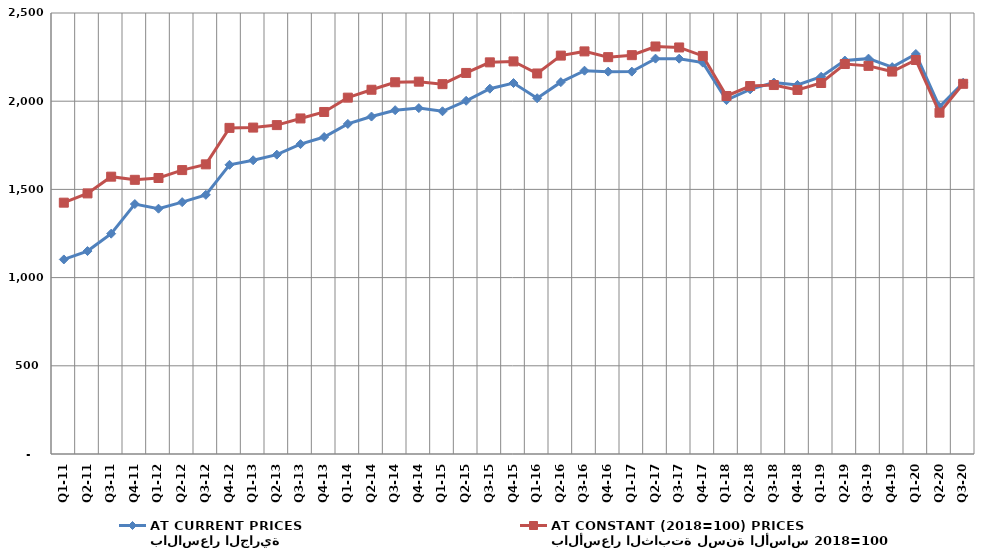
| Category | بالاسعار الجارية
AT CURRENT PRICES | بالأسعار الثابتة لسنة الأساس 2018=100
AT CONSTANT (2018=100) PRICES |
|---|---|---|
| Q1-11 | 1102.925 | 1424.812 |
| Q2-11 | 1150.415 | 1477.34 |
| Q3-11 | 1249.03 | 1572.237 |
| Q4-11 | 1416.824 | 1554.268 |
| Q1-12 | 1390.633 | 1564.664 |
| Q2-12 | 1427.74 | 1609.51 |
| Q3-12 | 1469.208 | 1642.022 |
| Q4-12 | 1639.306 | 1848.697 |
| Q1-13 | 1665.232 | 1850.42 |
| Q2-13 | 1696.946 | 1864.463 |
| Q3-13 | 1756.638 | 1902.224 |
| Q4-13 | 1796.917 | 1938.885 |
| Q1-14 | 1871.169 | 2020.114 |
| Q2-14 | 1912.952 | 2064.977 |
| Q3-14 | 1949.082 | 2107.424 |
| Q4-14 | 1960.788 | 2110.715 |
| Q1-15 | 1942.855 | 2096.679 |
| Q2-15 | 2002.314 | 2160.197 |
| Q3-15 | 2070.922 | 2220.237 |
| Q4-15 | 2103.052 | 2225.586 |
| Q1-16 | 2016.95 | 2157.136 |
| Q2-16 | 2108.037 | 2258.528 |
| Q3-16 | 2172.934 | 2282.299 |
| Q4-16 | 2167.624 | 2249.747 |
| Q1-17 | 2167.711 | 2261.008 |
| Q2-17 | 2241.286 | 2310.255 |
| Q3-17 | 2241.073 | 2304.641 |
| Q4-17 | 2218.605 | 2256.689 |
| Q1-18 | 2006.067 | 2029.494 |
| Q2-18 | 2067.045 | 2085.994 |
| Q3-18 | 2105.589 | 2091.587 |
| Q4-18 | 2092.273 | 2063.9 |
| Q1-19 | 2138.589 | 2103.138 |
| Q2-19 | 2230.35 | 2210.77 |
| Q3-19 | 2241.279 | 2200.283 |
| Q4-19 | 2193.01 | 2167.959 |
| Q1-20 | 2267.606 | 2233.578 |
| Q2-20 | 1967.941 | 1934.9 |
| Q3-20 | 2104.64 | 2098.575 |